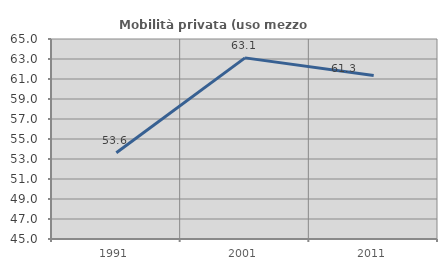
| Category | Mobilità privata (uso mezzo privato) |
|---|---|
| 1991.0 | 53.623 |
| 2001.0 | 63.111 |
| 2011.0 | 61.342 |